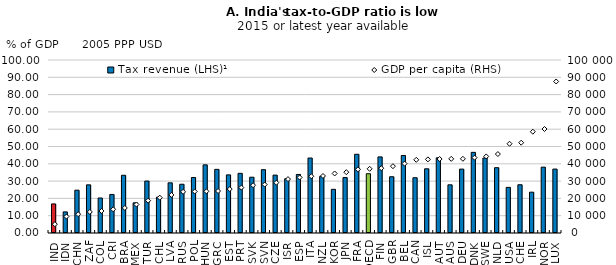
| Category | Tax revenue (LHS)¹ |
|---|---|
| IND | 16.8 |
| IDN | 12.2 |
| CHN | 24.75 |
| ZAF | 27.838 |
| COL | 20.231 |
| CRI | 22.28 |
| BRA | 33.378 |
| MEX | 17.438 |
| TUR | 30.031 |
| CHL | 20.699 |
| LVA | 29.001 |
| RUS | 28.18 |
| POL | 32.082 |
| HUN | 39.395 |
| GRC | 36.78 |
| EST | 33.594 |
| PRT | 34.489 |
| SVK | 32.25 |
| SVN | 36.599 |
| CZE | 33.47 |
| ISR | 31.374 |
| ESP | 33.849 |
| ITA | 43.335 |
| NZL | 32.759 |
| KOR | 25.251 |
| JPN | 32.043 |
| FRA | 45.504 |
| OECD | 34.267 |
| FIN | 43.988 |
| GBR | 32.516 |
| BEL | 44.807 |
| CAN | 31.941 |
| ISL | 37.116 |
| AUT | 43.456 |
| AUS | 27.847 |
| DEU | 36.937 |
| DNK | 46.622 |
| SWE | 43.335 |
| NLD | 37.751 |
| USA | 26.358 |
| CHE | 27.891 |
| IRL | 23.594 |
| NOR | 38.065 |
| LUX | 36.957 |